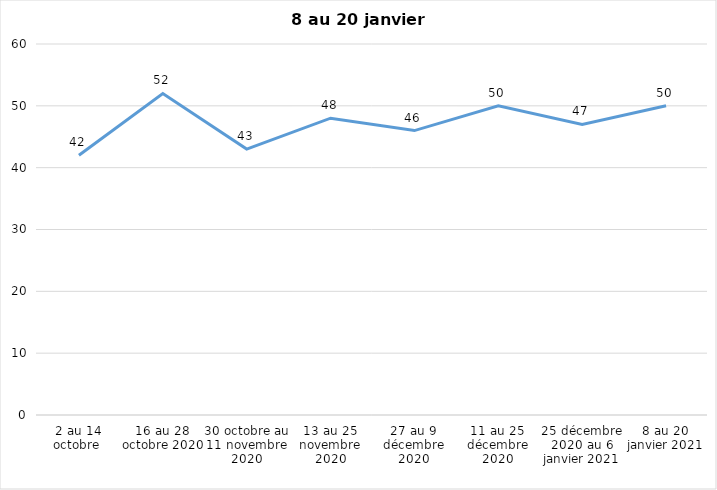
| Category | Toujours aux trois mesures |
|---|---|
| 2 au 14 octobre  | 42 |
| 16 au 28 octobre 2020 | 52 |
| 30 octobre au 11 novembre 2020 | 43 |
| 13 au 25 novembre 2020 | 48 |
| 27 au 9 décembre 2020 | 46 |
| 11 au 25 décembre 2020 | 50 |
| 25 décembre 2020 au 6 janvier 2021 | 47 |
| 8 au 20 janvier 2021 | 50 |